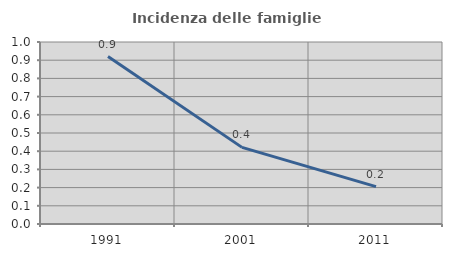
| Category | Incidenza delle famiglie numerose |
|---|---|
| 1991.0 | 0.92 |
| 2001.0 | 0.421 |
| 2011.0 | 0.205 |